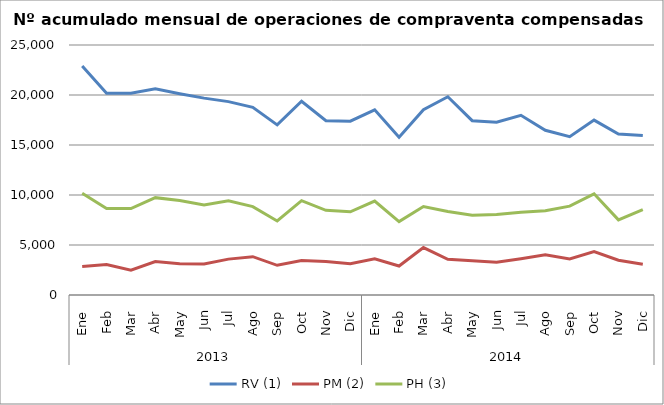
| Category | RV (1) | PM (2) | PH (3) |
|---|---|---|---|
| 0 | 22894 | 2853 | 10176 |
| 1 | 20174 | 3047 | 8641 |
| 2 | 20169 | 2472 | 8638 |
| 3 | 20616 | 3350 | 9736 |
| 4 | 20126 | 3117 | 9441 |
| 5 | 19686 | 3099 | 9000 |
| 6 | 19337 | 3588 | 9415 |
| 7 | 18769 | 3829 | 8838 |
| 8 | 17015 | 2969 | 7402 |
| 9 | 19371 | 3453 | 9435 |
| 10 | 17427 | 3359 | 8465 |
| 11 | 17377 | 3135 | 8315 |
| 12 | 18515 | 3629 | 9396 |
| 13 | 15776 | 2899 | 7337 |
| 14 | 18527 | 4739 | 8846 |
| 15 | 19824 | 3575 | 8345 |
| 16 | 17431 | 3429 | 7965 |
| 17 | 17272 | 3273 | 8041 |
| 18 | 17970 | 3623 | 8279 |
| 19 | 16473 | 4014 | 8423 |
| 20 | 15837 | 3610 | 8889 |
| 21 | 17491 | 4335 | 10117 |
| 22 | 16106 | 3478 | 7514 |
| 23 | 15951 | 3071 | 8545 |